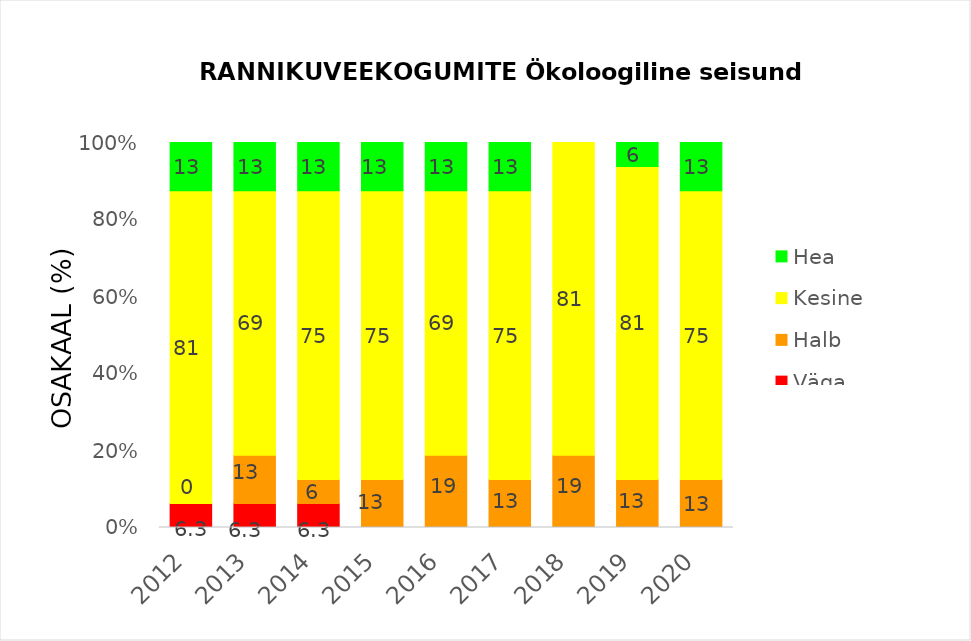
| Category | Väga halb | Halb | Kesine | Hea |
|---|---|---|---|---|
| 2012.0 | 6.25 | 0 | 81.25 | 12.5 |
| 2013.0 | 6.25 | 12.5 | 68.75 | 12.5 |
| 2014.0 | 6.25 | 6.25 | 75 | 12.5 |
| 2015.0 | 0 | 12.5 | 75 | 12.5 |
| 2016.0 | 0 | 18.75 | 68.75 | 12.5 |
| 2017.0 | 0 | 12.5 | 75 | 12.5 |
| 2018.0 | 0 | 18.75 | 81.25 | 0 |
| 2019.0 | 0 | 12.5 | 81.25 | 6.25 |
| 2020.0 | 0 | 12.5 | 75 | 12.5 |